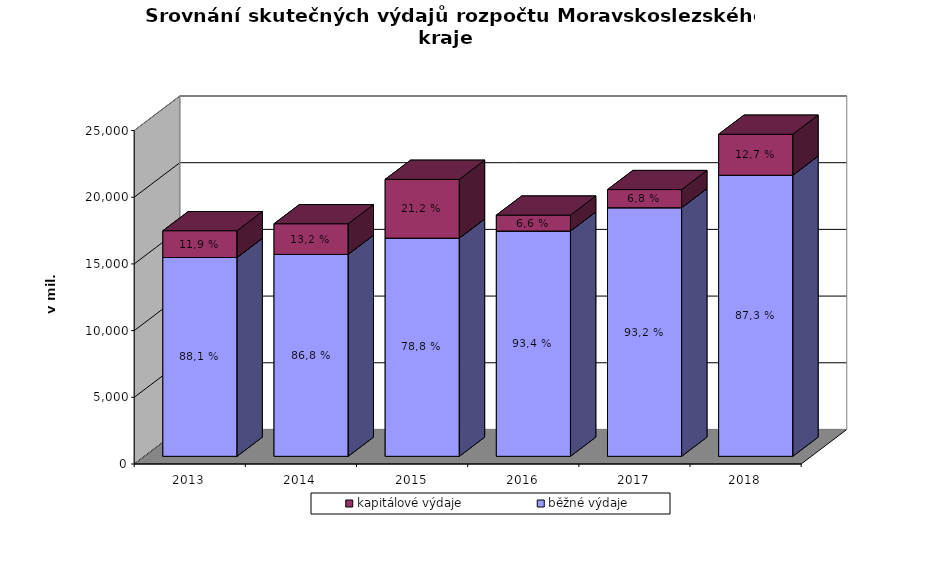
| Category | běžné výdaje | kapitálové výdaje |
|---|---|---|
| 2013.0 | 14904.712 | 2009.296 |
| 2014.0 | 15138.14 | 2299.407 |
| 2015.0 | 16356.738 | 4409.991 |
| 2016.0 | 16889.752 | 1192.562 |
| 2017.0 | 18636.111 | 1361.573 |
| 2018.0 | 21071.9 | 3075.103 |